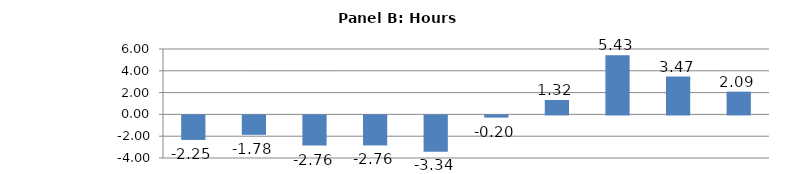
| Category | Series 0 |
|---|---|
| Crop and animal production | -2.252 |
| Wood product manufacturing | -1.781 |
| Forestry and logging | -2.763 |
| Paper manufacturing | -2.755 |
| Fishing, hunting and trapping | -3.34 |
| Mining (except oil and gas) | -0.201 |
| Support activities for agriculture and forestry | 1.324 |
| Support activities for mining and oil and gas | 5.429 |
| Oil and gas extraction | 3.468 |
| Petroleum and coal products manufacturing | 2.085 |